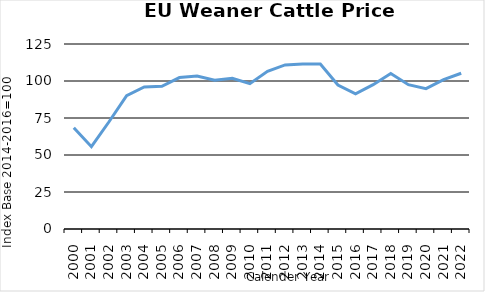
| Category | Series 0 |
|---|---|
| 2000.0 | 68.366 |
| 2001.0 | 55.628 |
| 2002.0 | 72.464 |
| 2003.0 | 90.169 |
| 2004.0 | 95.94 |
| 2005.0 | 96.454 |
| 2006.0 | 102.305 |
| 2007.0 | 103.399 |
| 2008.0 | 100.466 |
| 2009.0 | 101.783 |
| 2010.0 | 98.19 |
| 2011.0 | 106.599 |
| 2012.0 | 110.843 |
| 2013.0 | 111.439 |
| 2014.0 | 111.447 |
| 2015.0 | 97.289 |
| 2016.0 | 91.263 |
| 2017.0 | 97.514 |
| 2018.0 | 105.051 |
| 2019.0 | 97.51 |
| 2020.0 | 94.836 |
| 2021.0 | 100.882 |
| 2022.0 | 105.252 |